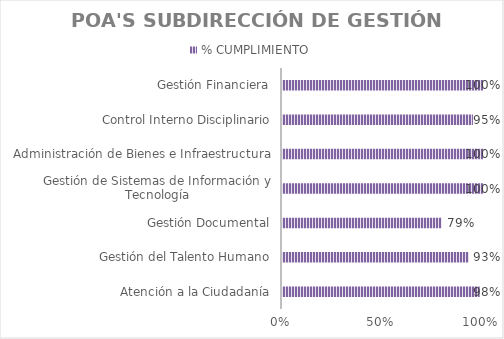
| Category | % CUMPLIMIENTO |
|---|---|
| Atención a la Ciudadanía | 0.983 |
| Gestión del Talento Humano | 0.93 |
| Gestión Documental | 0.794 |
| Gestión de Sistemas de Información y Tecnología | 1 |
| Administración de Bienes e Infraestructura | 1 |
| Control Interno Disciplinario | 0.95 |
| Gestión Financiera | 1 |